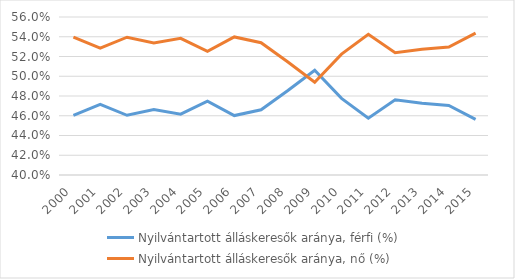
| Category | Nyilvántartott álláskeresők aránya, férfi (%) | Nyilvántartott álláskeresők aránya, nő (%) |
|---|---|---|
| 2000.0 | 0.46 | 0.54 |
| 2001.0 | 0.471 | 0.529 |
| 2002.0 | 0.46 | 0.54 |
| 2003.0 | 0.466 | 0.534 |
| 2004.0 | 0.462 | 0.538 |
| 2005.0 | 0.475 | 0.525 |
| 2006.0 | 0.46 | 0.54 |
| 2007.0 | 0.466 | 0.534 |
| 2008.0 | 0.486 | 0.514 |
| 2009.0 | 0.506 | 0.494 |
| 2010.0 | 0.478 | 0.522 |
| 2011.0 | 0.458 | 0.542 |
| 2012.0 | 0.476 | 0.524 |
| 2013.0 | 0.473 | 0.527 |
| 2014.0 | 0.47 | 0.53 |
| 2015.0 | 0.456 | 0.544 |